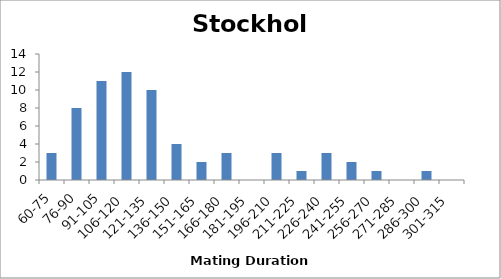
| Category | Series 0 |
|---|---|
| 60-75 | 3 |
| 76-90 | 8 |
| 91-105 | 11 |
| 106-120 | 12 |
| 121-135 | 10 |
| 136-150 | 4 |
| 151-165 | 2 |
| 166-180 | 3 |
| 181-195 | 0 |
| 196-210 | 3 |
| 211-225 | 1 |
| 226-240 | 3 |
| 241-255 | 2 |
| 256-270 | 1 |
| 271-285 | 0 |
| 286-300 | 1 |
| 301-315 | 0 |